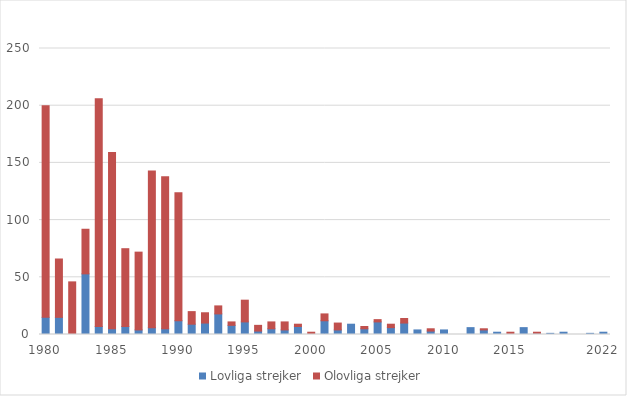
| Category | Lovliga strejker | Olovliga strejker |
|---|---|---|
| 1980 | 15 | 185 |
|  | 15 | 51 |
|  | 0 | 46 |
|  | 53 | 39 |
|  | 7 | 199 |
| 1985 | 5 | 154 |
|  | 7 | 68 |
|  | 4 | 68 |
|  | 6 | 137 |
|  | 5 | 133 |
| 1990 | 12 | 112 |
|  | 9 | 11 |
|  | 10 | 9 |
|  | 18 | 7 |
|  | 8 | 3 |
| 1995 | 11 | 19 |
|  | 3 | 5 |
|  | 5 | 6 |
|  | 4 | 7 |
|  | 7 | 2 |
| 2000 | 0 | 2 |
|  | 12 | 6 |
|  | 4 | 6 |
|  | 9 | 0 |
|  | 5 | 2 |
| 2005 | 11 | 2 |
|  | 6 | 3 |
|  | 10 | 4 |
|  | 4 | 0 |
|  | 3 | 2 |
| 2010 | 4 | 0 |
|  | 0 | 0 |
|  | 6 | 0 |
|  | 4 | 1 |
|  | 2 | 0 |
| 2015 | 0 | 2 |
|  | 6 | 0 |
|  | 1 | 1 |
|  | 1 | 0 |
|  | 2 | 0 |
|  | 0 | 0 |
|  | 1 | 0 |
| 2022 | 2 | 0 |